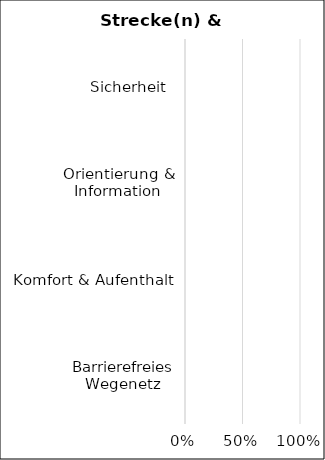
| Category | Series 0 |
|---|---|
| Barrierefreies Wegenetz | 0 |
| Komfort & Aufenthalt | 0 |
| Orientierung & Information | 0 |
| Sicherheit  | 0 |